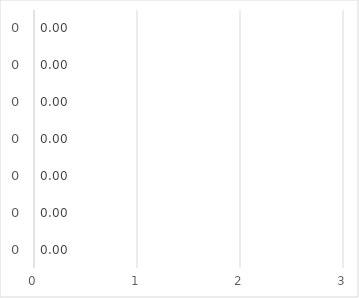
| Category | Participation in decisions |
|---|---|
| 0.0 | 0 |
| 0.0 | 0 |
| 0.0 | 0 |
| 0.0 | 0 |
| 0.0 | 0 |
| 0.0 | 0 |
| 0.0 | 0 |